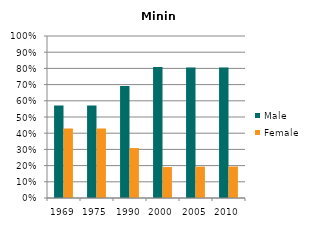
| Category | Male | Female |
|---|---|---|
| 1969.0 | 0.571 | 0.429 |
| 1975.0 | 0.571 | 0.429 |
| 1990.0 | 0.692 | 0.308 |
| 2000.0 | 0.809 | 0.191 |
| 2005.0 | 0.806 | 0.194 |
| 2010.0 | 0.806 | 0.194 |